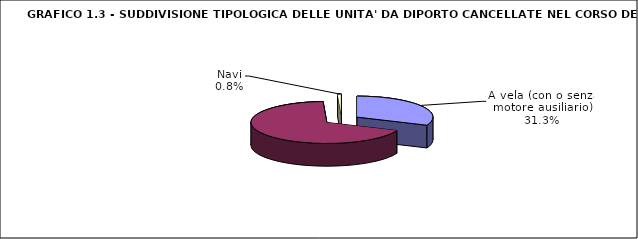
| Category | Series 0 |
|---|---|
| A vela (con o senza motore ausiliario) | 393 |
| A motore | 852 |
| Navi | 10 |